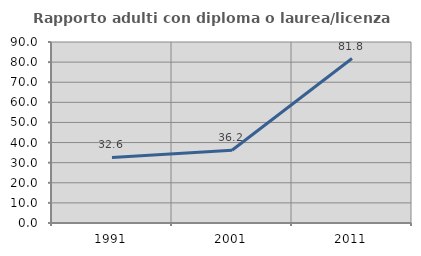
| Category | Rapporto adulti con diploma o laurea/licenza media  |
|---|---|
| 1991.0 | 32.609 |
| 2001.0 | 36.164 |
| 2011.0 | 81.789 |